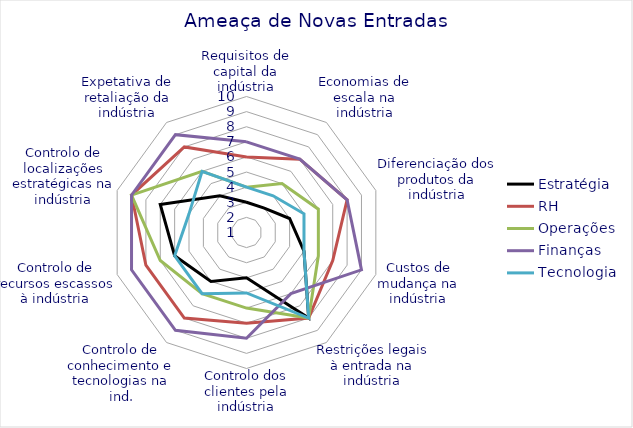
| Category | Estratégia | RH | Operações | Finanças | Tecnologia |
|---|---|---|---|---|---|
| Requisitos de capital da indústria | 3 | 6 | 4 | 7 | 4 |
| Economias de escala na indústria | 3 | 7 | 5 | 7 | 4 |
| Diferenciação dos produtos da indústria | 4 | 8 | 6 | 8 | 5 |
| Custos de mudança na indústria | 5 | 7 | 6 | 9 | 5 |
| Restrições legais à entrada na indústria | 8 | 8 | 8 | 6 | 8 |
| Controlo dos clientes pela indústria | 4 | 7 | 6 | 8 | 5 |
| Controlo de conhecimento e tecnologias na ind. | 5 | 8 | 6 | 9 | 6 |
| Controlo de recursos escassos à indústria | 6 | 8 | 7 | 9 | 6 |
| Controlo de localizações estratégicas na indústria | 7 | 9 | 9 | 9 | 5 |
| Expetativa de retaliação da indústria | 4 | 8 | 6 | 9 | 6 |